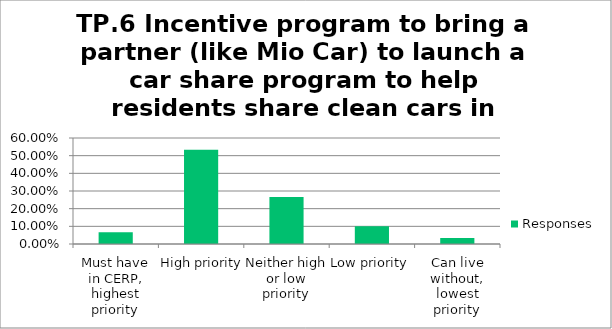
| Category | Responses |
|---|---|
| Must have in CERP, highest priority | 0.067 |
| High priority | 0.533 |
| Neither high or low priority | 0.267 |
| Low priority | 0.1 |
| Can live without, lowest priority | 0.033 |